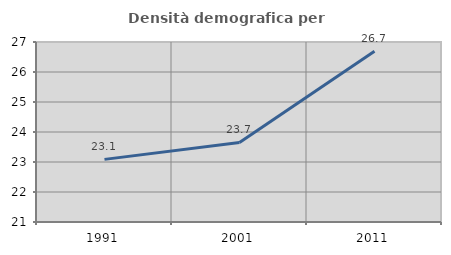
| Category | Densità demografica |
|---|---|
| 1991.0 | 23.088 |
| 2001.0 | 23.652 |
| 2011.0 | 26.691 |